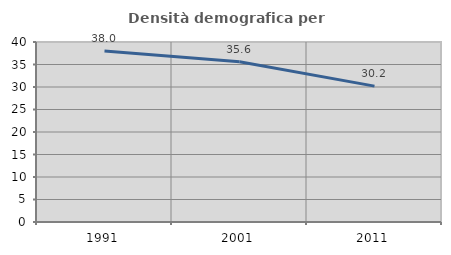
| Category | Densità demografica |
|---|---|
| 1991.0 | 38.004 |
| 2001.0 | 35.592 |
| 2011.0 | 30.191 |